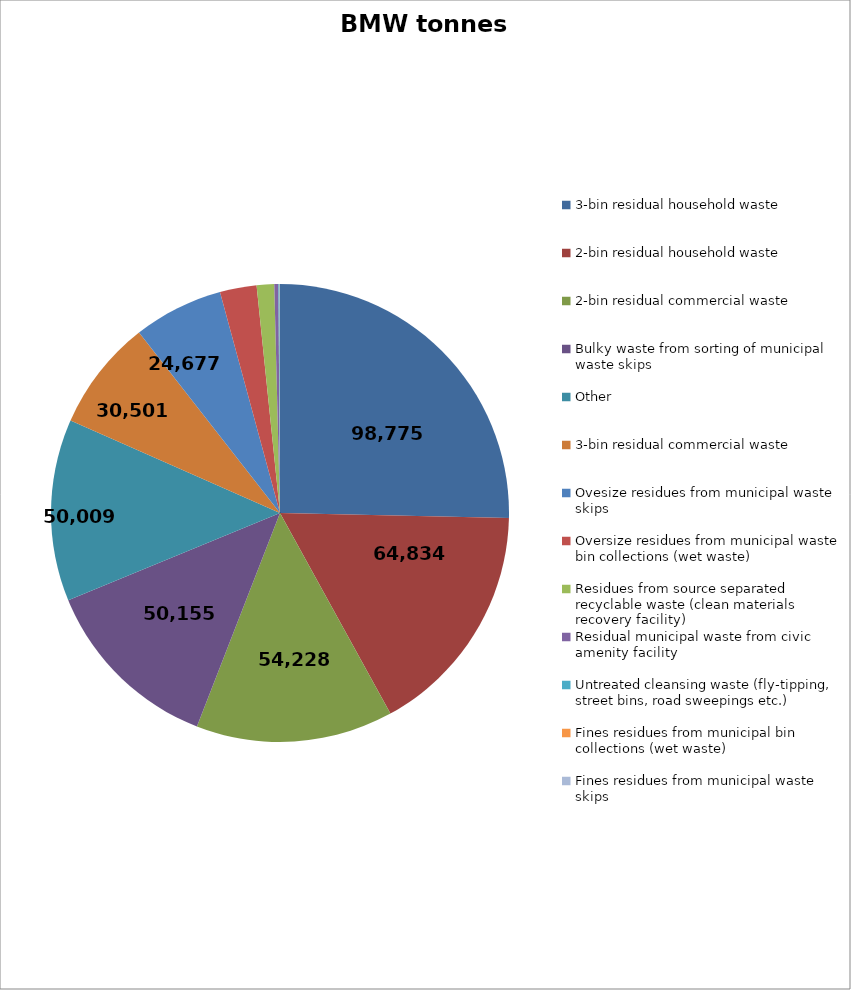
| Category | BMW tonnes 2016 |
|---|---|
| 3-bin residual household waste | 98775.03 |
| 2-bin residual household waste | 64833.86 |
| 2-bin residual commercial waste | 54228.16 |
| Bulky waste from sorting of municipal waste skips | 50154.89 |
| Other | 50009.15 |
| 3-bin residual commercial waste | 30501.24 |
| Ovesize residues from municipal waste skips | 24676.99 |
| Oversize residues from municipal waste bin collections (wet waste) | 10086.88 |
| Residues from source separated recyclable waste (clean materials recovery facility) | 4807.27 |
| Residual municipal waste from civic amenity facility | 1124.14 |
| Untreated cleansing waste (fly-tipping, street bins, road sweepings etc.) | 325.02 |
| Fines residues from municipal bin collections (wet waste) | 52.67 |
| Fines residues from municipal waste skips | 47.91 |